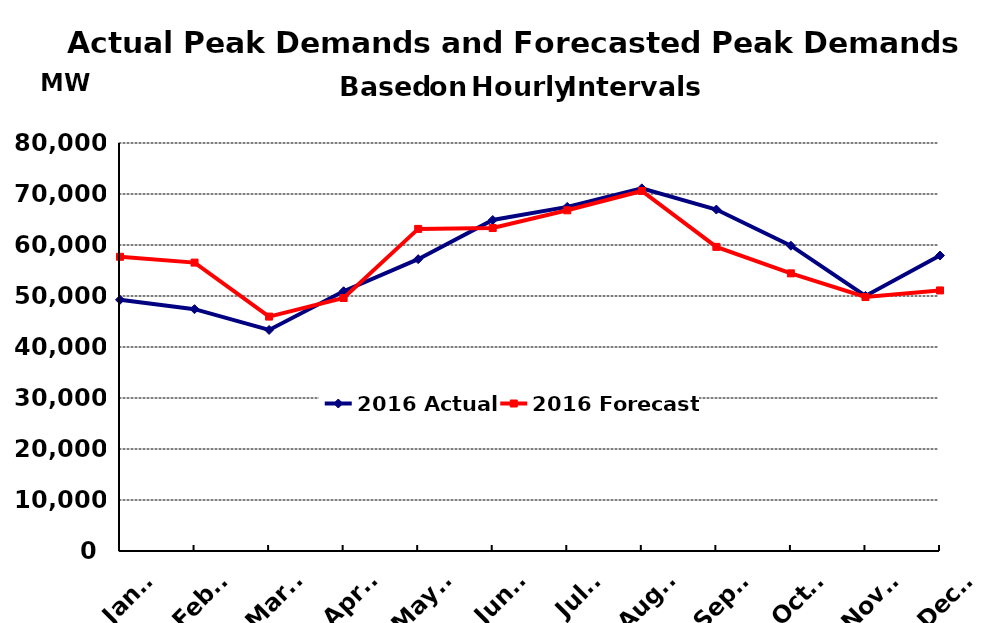
| Category | 2016 Actual | 2016 Forecast |
|---|---|---|
| Jan** | 49262.558 | 57691 |
| Feb** | 47416.492 | 56550 |
| Mar** | 43347.187 | 45965 |
| Apr** | 50932.083 | 49607 |
| May** | 57223.827 | 63158 |
| Jun** | 64896.26 | 63325 |
| Jul** | 67468.932 | 66802 |
| Aug** | 71110.104 | 70588 |
| Sep** | 66948.566 | 59636 |
| Oct** | 59864.268 | 54437 |
| Nov** | 50012.351 | 49799 |
| Dec** | 57932.433 | 51092 |